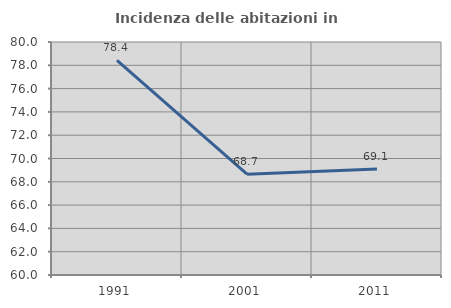
| Category | Incidenza delle abitazioni in proprietà  |
|---|---|
| 1991.0 | 78.423 |
| 2001.0 | 68.651 |
| 2011.0 | 69.106 |